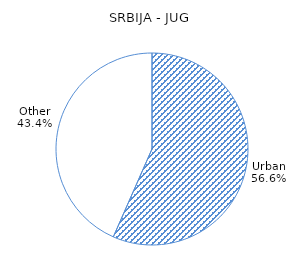
| Category | Series 0 |
|---|---|
| Urban | 56.6 |
| Other | 43.4 |